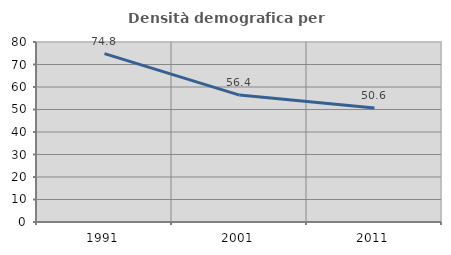
| Category | Densità demografica |
|---|---|
| 1991.0 | 74.846 |
| 2001.0 | 56.408 |
| 2011.0 | 50.643 |